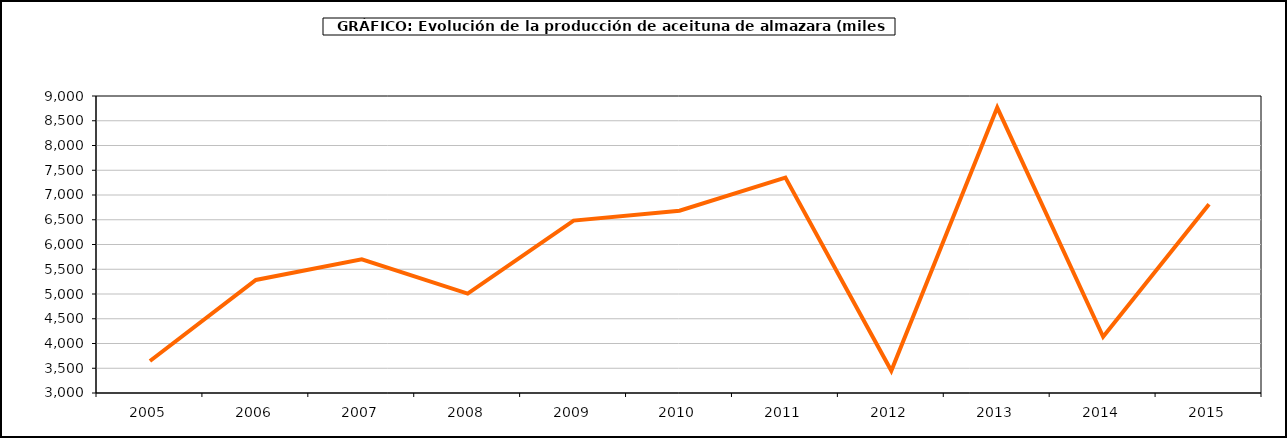
| Category | producción |
|---|---|
| 2005.0 | 3646.301 |
| 2006.0 | 5283.345 |
| 2007.0 | 5701.679 |
| 2008.0 | 5008.9 |
| 2009.0 | 6482.726 |
| 2010.0 | 6682.009 |
| 2011.0 | 7352.697 |
| 2012.0 | 3448.612 |
| 2013.0 | 8766.897 |
| 2014.0 | 4136.73 |
| 2015.0 | 6811.611 |